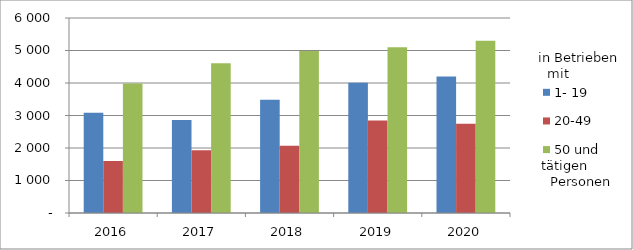
| Category | 1- 19 | 20-49 | 50 und mehr |
|---|---|---|---|
| 2016.0 | 3086 | 1603 | 3988 |
| 2017.0 | 2864 | 1931 | 4609 |
| 2018.0 | 3488 | 2071 | 4982 |
| 2019.0 | 4006 | 2850 | 5103 |
| 2020.0 | 4199 | 2746 | 5303 |